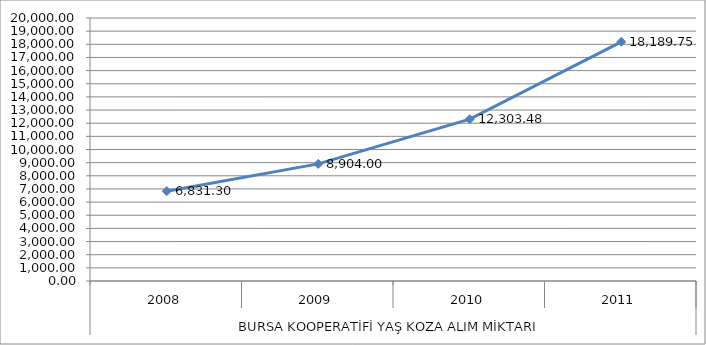
| Category | BURSA KOOP. |
|---|---|
| 0 | 6831.3 |
| 1 | 8904 |
| 2 | 12303.48 |
| 3 | 18189.75 |